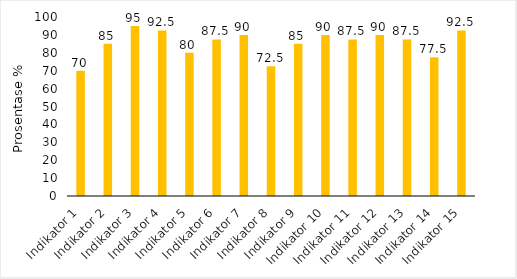
| Category | Series 0 |
|---|---|
| Indikator 1 | 70 |
| Indikator 2 | 85 |
| Indikator 3 | 95 |
| Indikator 4 | 92.5 |
| Indikator 5 | 80 |
| Indikator 6 | 87.5 |
| Indikator 7 | 90 |
| Indikator 8 | 72.5 |
| Indikator 9 | 85 |
| Indikator 10 | 90 |
| Indikator 11 | 87.5 |
| Indikator 12 | 90 |
| Indikator 13 | 87.5 |
| Indikator 14 | 77.5 |
| Indikator 15 | 92.5 |